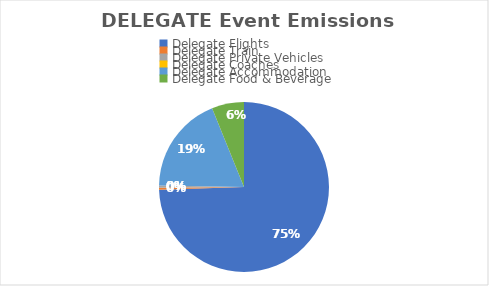
| Category | Series 0 |
|---|---|
| Delegate Flights | 30.4 |
| Delegate Train | 0.166 |
| Delegate Private Vehicles | 0.157 |
| Delegate Coaches | 0 |
| Delegate Accommodation | 7.6 |
| Delegate Food & Beverage | 2.5 |